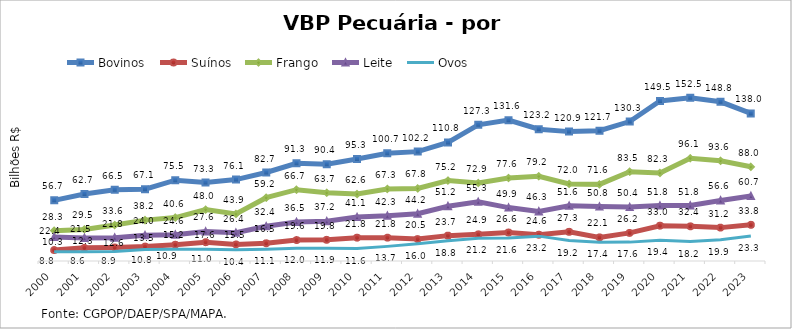
| Category | Bovinos | Suínos | Frango | Leite | Ovos |
|---|---|---|---|---|---|
| 2000 | 56.682 | 10.263 | 28.313 | 22.389 | 8.754 |
| 2001 | 62.657 | 12.313 | 29.548 | 21.544 | 8.626 |
| 2002 | 66.491 | 12.62 | 33.554 | 21.815 | 8.887 |
| 2003 | 67.107 | 13.487 | 38.199 | 24.024 | 10.75 |
| 2004 | 75.503 | 15.164 | 40.587 | 24.553 | 10.896 |
| 2005 | 73.303 | 17.581 | 48.037 | 27.615 | 10.97 |
| 2006 | 76.106 | 15.465 | 43.948 | 26.377 | 10.42 |
| 2007 | 82.71 | 16.537 | 59.17 | 32.427 | 11.074 |
| 2008 | 91.321 | 19.582 | 66.667 | 36.479 | 11.96 |
| 2009 | 90.369 | 19.794 | 63.726 | 37.19 | 11.925 |
| 2010 | 95.276 | 21.775 | 62.581 | 41.072 | 11.599 |
| 2011 | 100.721 | 21.81 | 67.314 | 42.34 | 13.667 |
| 2012 | 102.223 | 20.478 | 67.788 | 44.244 | 16.021 |
| 2013 | 110.773 | 23.711 | 75.206 | 51.199 | 18.843 |
| 2014 | 127.258 | 24.904 | 72.897 | 55.288 | 21.171 |
| 2015 | 131.638 | 26.614 | 77.595 | 49.907 | 21.556 |
| 2016 | 123.219 | 24.561 | 79.195 | 46.308 | 23.239 |
| 2017 | 120.919 | 27.265 | 72.033 | 51.596 | 19.155 |
| 2018 | 121.729 | 22.081 | 71.613 | 50.829 | 17.418 |
| 2019 | 130.345 | 26.246 | 83.455 | 50.358 | 17.641 |
| 2020 | 149.514 | 32.991 | 82.316 | 51.775 | 19.373 |
| 2021 | 152.464 | 32.403 | 96.07 | 51.832 | 18.154 |
| 2022 | 148.773 | 31.201 | 93.637 | 56.591 | 19.887 |
| 2023 | 137.965 | 33.803 | 88.032 | 60.704 | 23.305 |